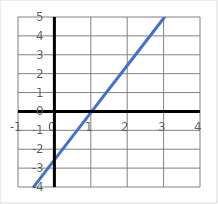
| Category | y |
|---|---|
| -1.0 | -5 |
| 0.0 | -2.5 |
| 1.0 | 0 |
| 2.0 | 2.5 |
| 3.0 | 5 |
| 4.0 | 7.5 |